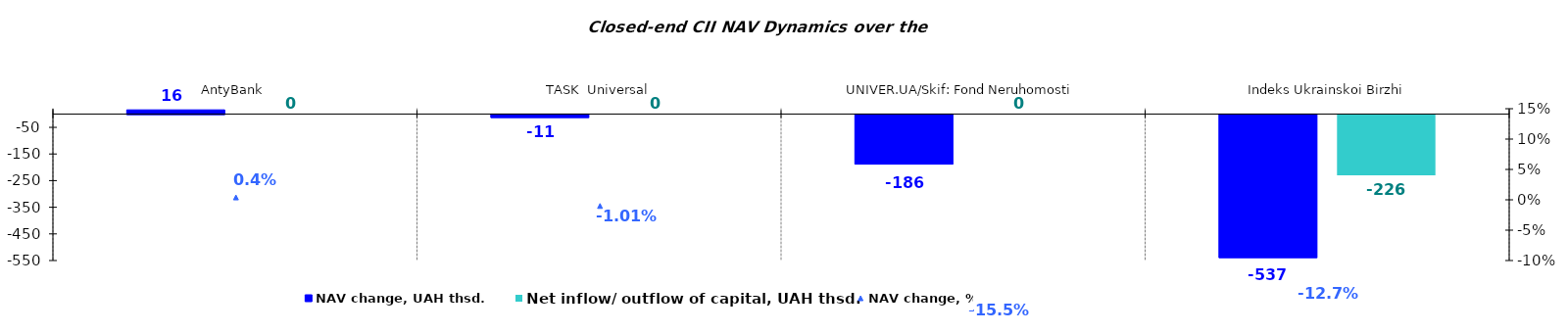
| Category | NAV change, UAH thsd. | Net inflow/ outflow of capital, UAH thsd. |
|---|---|---|
| AntyBank | 15.718 | 0 |
| TASK  Universal | -11.187 | 0 |
| UNIVER.UA/Skif: Fond Neruhomosti | -186.199 | 0 |
| Indeks Ukrainskoi Birzhi | -537.397 | -225.973 |